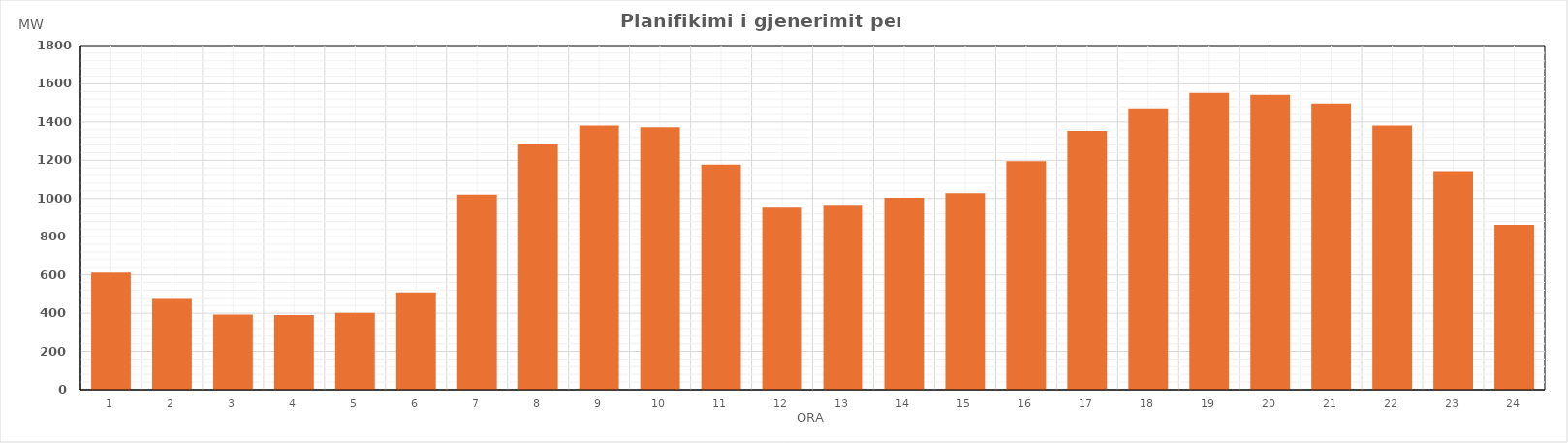
| Category | Max (MW) |
|---|---|
| 0 | 612.35 |
| 1 | 479.26 |
| 2 | 393.14 |
| 3 | 390.84 |
| 4 | 401.34 |
| 5 | 507.89 |
| 6 | 1020.24 |
| 7 | 1283.21 |
| 8 | 1381.68 |
| 9 | 1372.28 |
| 10 | 1177.71 |
| 11 | 952.48 |
| 12 | 967.61 |
| 13 | 1003.7 |
| 14 | 1027.69 |
| 15 | 1195.06 |
| 16 | 1353.6 |
| 17 | 1471.37 |
| 18 | 1553.33 |
| 19 | 1542.14 |
| 20 | 1497.16 |
| 21 | 1381.85 |
| 22 | 1143.38 |
| 23 | 861.6 |